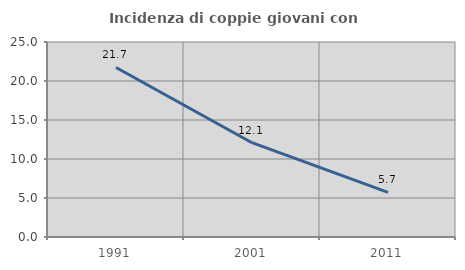
| Category | Incidenza di coppie giovani con figli |
|---|---|
| 1991.0 | 21.733 |
| 2001.0 | 12.089 |
| 2011.0 | 5.717 |